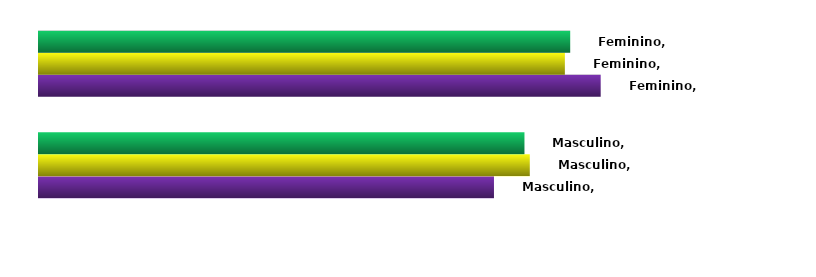
| Category | Concluintes | Matriculados | Ingressantes |
|---|---|---|---|
| Masculino | 0.448 | 0.483 | 0.478 |
| Feminino | 0.552 | 0.517 | 0.522 |